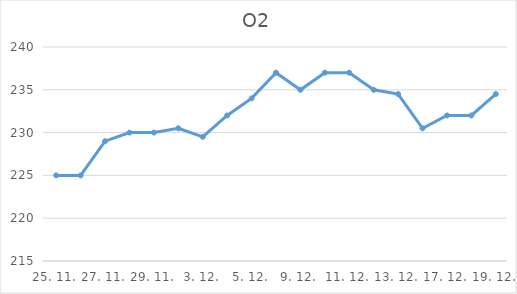
| Category | O2 |
|---|---|
| 25. 11. | 225 |
| 26. 11. | 225 |
| 27. 11. | 229 |
| 28. 11. | 230 |
| 29. 11. | 230 |
| 2. 12. | 230.5 |
| 3. 12. | 229.5 |
| 4. 12. | 232 |
| 5. 12. | 234 |
| 6. 12. | 237 |
| 9. 12. | 235 |
| 10. 12. | 237 |
| 11. 12. | 237 |
| 12. 12. | 235 |
| 13. 12. | 234.5 |
| 16. 12. | 230.5 |
| 17. 12. | 232 |
| 18. 12. | 232 |
| 19. 12. | 234.5 |